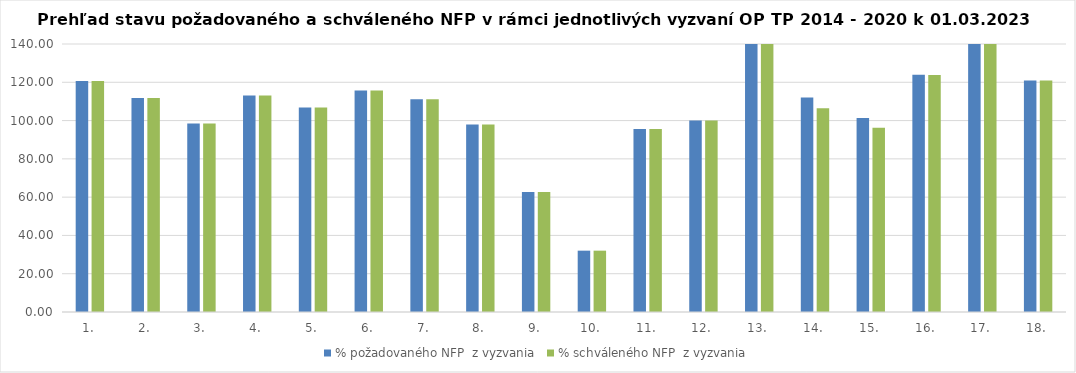
| Category | % požadovaného NFP  z vyzvania | % schváleného NFP  z vyzvania |
|---|---|---|
| 1. | 120.673 | 120.673 |
| 2. | 111.84 | 111.84 |
| 3. | 98.474 | 98.474 |
| 4. | 113.162 | 113.162 |
| 5. | 106.767 | 106.767 |
| 6. | 115.745 | 115.745 |
| 7. | 111.089 | 111.089 |
| 8. | 97.998 | 97.998 |
| 9. | 62.727 | 62.727 |
| 10. | 32.041 | 32.041 |
| 11. | 95.621 | 95.621 |
| 12. | 100.009 | 100.009 |
| 13. | 151.956 | 151.956 |
| 14. | 112.099 | 106.468 |
| 15. | 101.339 | 96.301 |
| 16. | 123.881 | 123.771 |
| 17. | 171.931 | 171.931 |
| 18. | 120.879 | 120.879 |